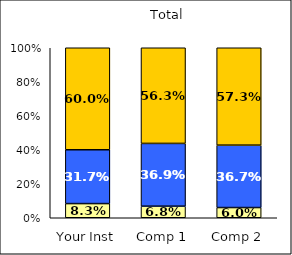
| Category | Low Civic Minded Values | Average Civic Minded Values | High Civic Minded Values |
|---|---|---|---|
| Your Inst | 0.083 | 0.317 | 0.6 |
| Comp 1 | 0.068 | 0.369 | 0.563 |
| Comp 2 | 0.06 | 0.367 | 0.573 |